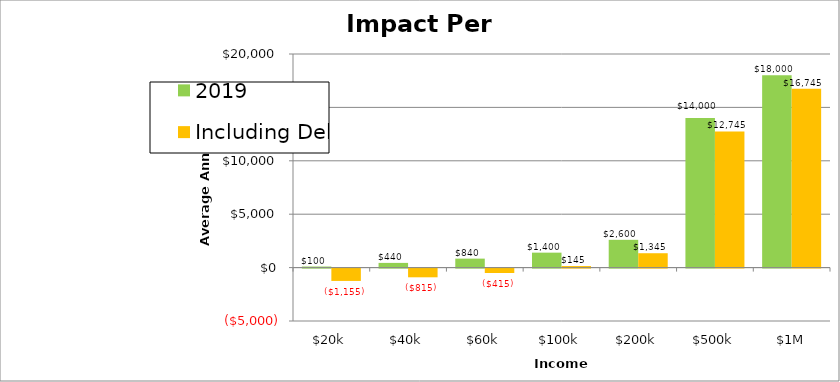
| Category | 2019 | Including Debt |
|---|---|---|
| $20k | 100 | -1154.541 |
| $40k | 440 | -814.541 |
| $60k | 840 | -414.541 |
| $100k | 1400 | 145.459 |
| $200k | 2600 | 1345.459 |
| $500k | 14000 | 12745.459 |
| $1M | 18000 | 16745.459 |